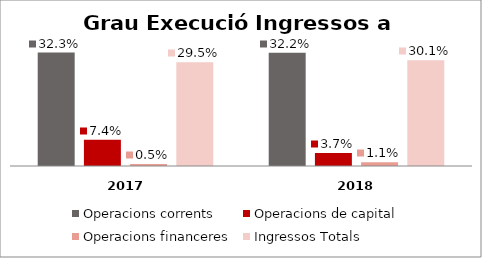
| Category | Operacions corrents | Operacions de capital | Operacions financeres | Ingressos Totals |
|---|---|---|---|---|
| 0 | 0.323 | 0.074 | 0.005 | 0.295 |
| 1 | 0.322 | 0.037 | 0.011 | 0.301 |